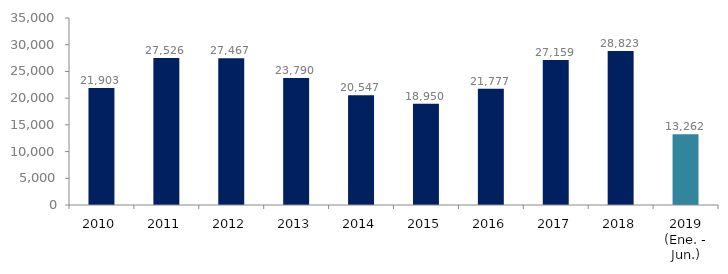
| Category | Series 1 |
|---|---|
| 2010 | 21903 |
| 2011 | 27526 |
| 2012 | 27467 |
| 2013 | 23790 |
| 2014 | 20547 |
| 2015 | 18950.14 |
| 2016 | 21776.636 |
| 2017 | 27158.582 |
| 2018 | 28823.486 |
| 2019 (Ene. - Jun.) | 13262.032 |